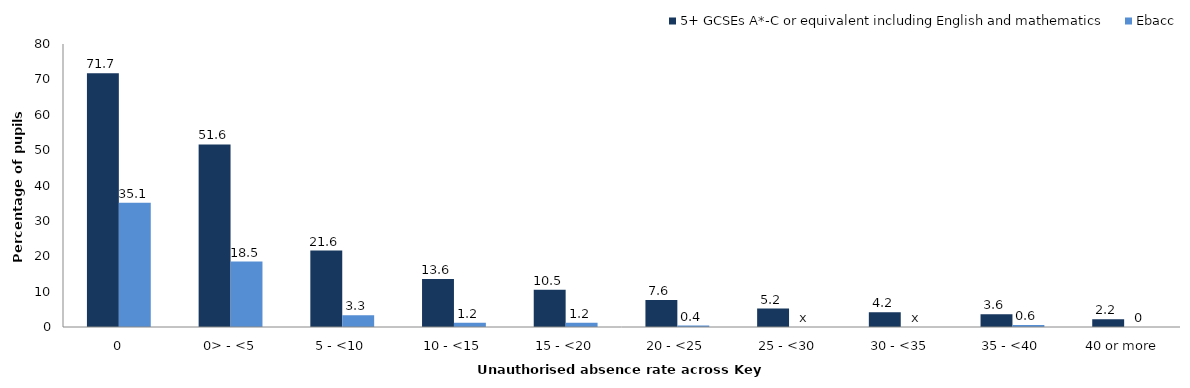
| Category | 5+ GCSEs A*-C or equivalent including English and mathematics | Ebacc |
|---|---|---|
| 0 | 71.7 | 35.1 |
| 0> - <5 | 51.6 | 18.5 |
| 5 - <10 | 21.6 | 3.3 |
| 10 - <15 | 13.6 | 1.2 |
| 15 - <20 | 10.5 | 1.2 |
| 20 - <25 | 7.6 | 0.4 |
| 25 - <30 | 5.2 | 0 |
| 30 - <35 | 4.2 | 0 |
| 35 - <40 | 3.6 | 0.6 |
| 40 or more | 2.2 | 0 |